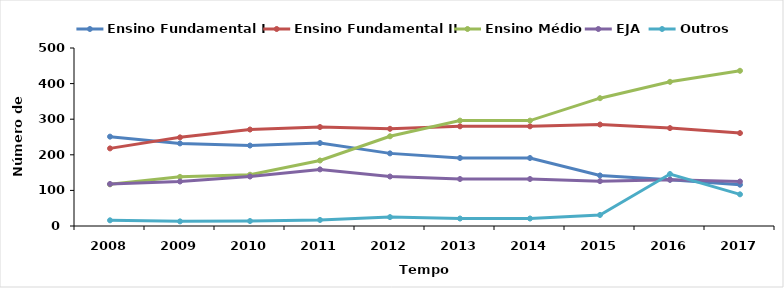
| Category | Ensino Fundamental I | Ensino Fundamental II | Ensino Médio | EJA | Outros |
|---|---|---|---|---|---|
| 2008.0 | 251 | 218 | 117 | 118 | 16 |
| 2009.0 | 232 | 249 | 138 | 125 | 13 |
| 2010.0 | 226 | 271 | 144 | 139 | 14 |
| 2011.0 | 233 | 278 | 184 | 159 | 17 |
| 2012.0 | 204 | 273 | 252 | 139 | 25 |
| 2013.0 | 191 | 280 | 296 | 132 | 21 |
| 2014.0 | 191 | 280 | 296 | 132 | 21 |
| 2015.0 | 142 | 285 | 359 | 126 | 31 |
| 2016.0 | 130 | 275 | 405 | 130 | 146 |
| 2017.0 | 116 | 261 | 436 | 125 | 89 |